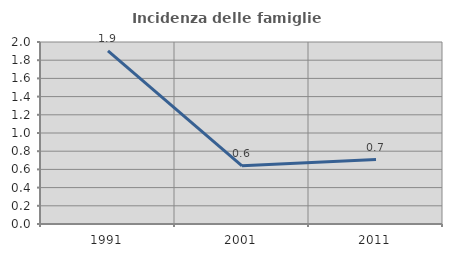
| Category | Incidenza delle famiglie numerose |
|---|---|
| 1991.0 | 1.901 |
| 2001.0 | 0.64 |
| 2011.0 | 0.708 |